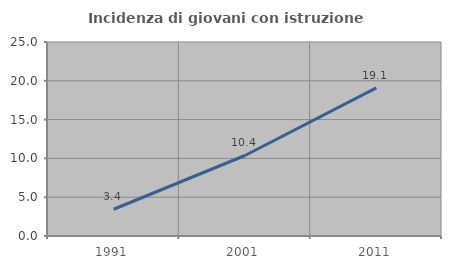
| Category | Incidenza di giovani con istruzione universitaria |
|---|---|
| 1991.0 | 3.448 |
| 2001.0 | 10.375 |
| 2011.0 | 19.094 |